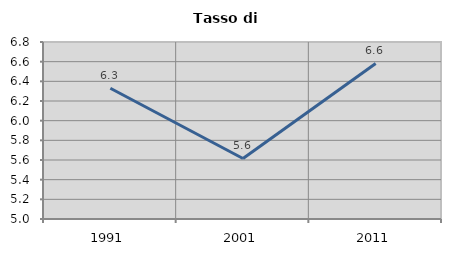
| Category | Tasso di disoccupazione   |
|---|---|
| 1991.0 | 6.33 |
| 2001.0 | 5.616 |
| 2011.0 | 6.582 |